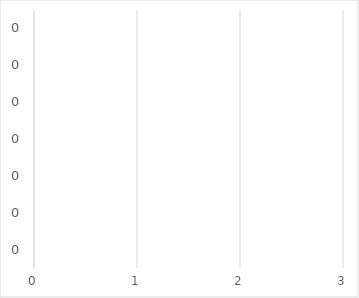
| Category | Fair law enforcement |
|---|---|
| 0.0 | 0 |
| 0.0 | 0 |
| 0.0 | 0 |
| 0.0 | 0 |
| 0.0 | 0 |
| 0.0 | 0 |
| 0.0 | 0 |